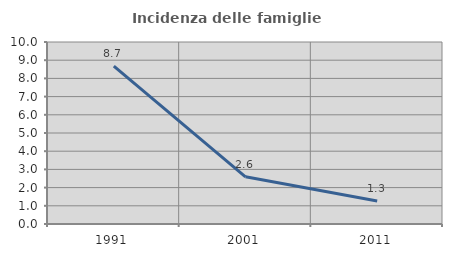
| Category | Incidenza delle famiglie numerose |
|---|---|
| 1991.0 | 8.675 |
| 2001.0 | 2.593 |
| 2011.0 | 1.265 |